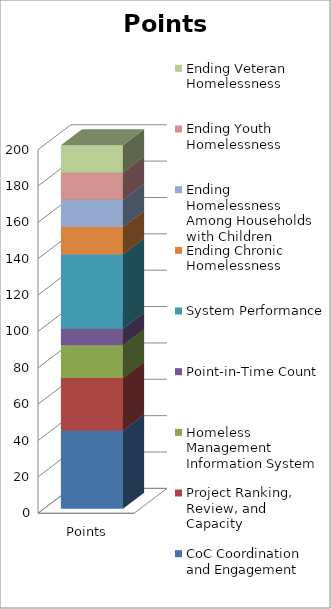
| Category | CoC Coordination and Engagement | Project Ranking, Review, and Capacity | Homeless Management Information System | Point-in-Time Count | System Performance | Ending Chronic Homelessness | Ending Homelessness Among Households with Children | Ending Youth Homelessness | Ending Veteran Homelessness |
|---|---|---|---|---|---|---|---|---|---|
| Points Available | 43 | 29 | 18 | 9 | 41 | 15 | 15 | 15 | 15 |